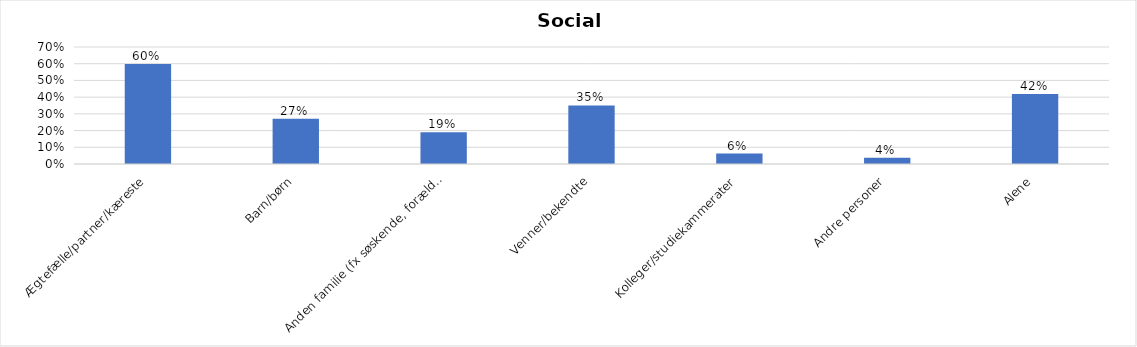
| Category | % |
|---|---|
| Ægtefælle/partner/kæreste | 0.598 |
| Barn/børn | 0.271 |
| Anden familie (fx søskende, forældre) | 0.19 |
| Venner/bekendte | 0.35 |
| Kolleger/studiekammerater | 0.063 |
| Andre personer | 0.037 |
| Alene | 0.418 |